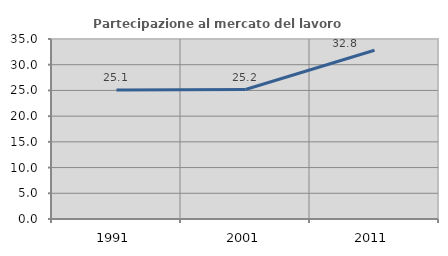
| Category | Partecipazione al mercato del lavoro  femminile |
|---|---|
| 1991.0 | 25.061 |
| 2001.0 | 25.172 |
| 2011.0 | 32.804 |